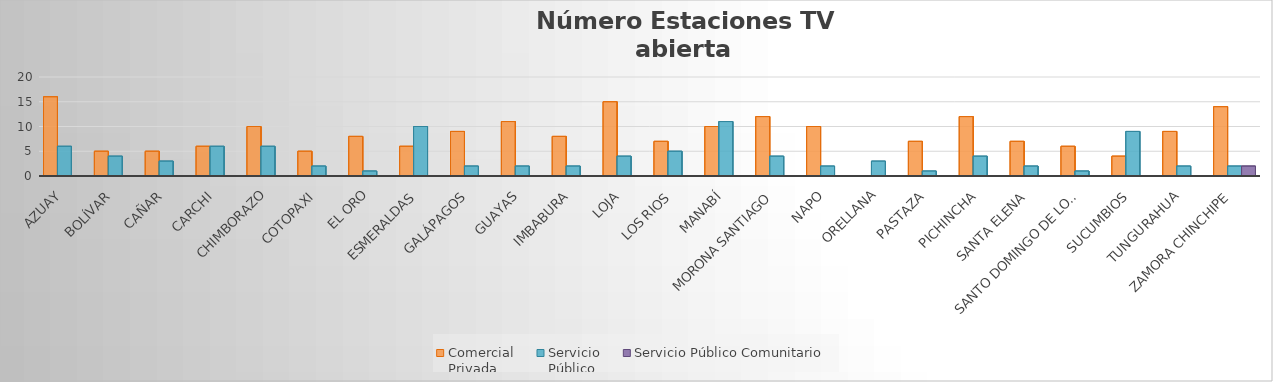
| Category | Comercial 
Privada | Servicio 
Público | Servicio Público Comunitario |
|---|---|---|---|
| Azuay | 16 | 6 | 0 |
| Bolívar | 5 | 4 | 0 |
| Cañar | 5 | 3 | 0 |
| Carchi | 6 | 6 | 0 |
| Chimborazo | 10 | 6 | 0 |
| Cotopaxi | 5 | 2 | 0 |
| El Oro | 8 | 1 | 0 |
| Esmeraldas | 6 | 10 | 0 |
| Galápagos | 9 | 2 | 0 |
| Guayas | 11 | 2 | 0 |
| Imbabura | 8 | 2 | 0 |
| Loja | 15 | 4 | 0 |
| Los Rios | 7 | 5 | 0 |
| Manabí | 10 | 11 | 0 |
| Morona Santiago | 12 | 4 | 0 |
| Napo | 10 | 2 | 0 |
| Orellana | 0 | 3 | 0 |
| Pastaza | 7 | 1 | 0 |
| Pichincha | 12 | 4 | 0 |
| Santa Elena | 7 | 2 | 0 |
| Santo Domingo de los Tsáchilas | 6 | 1 | 0 |
| Sucumbios | 4 | 9 | 0 |
| Tungurahua | 9 | 2 | 0 |
| Zamora Chinchipe | 14 | 2 | 2 |